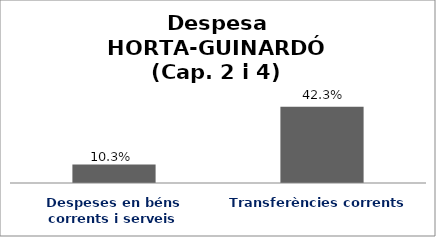
| Category | Series 0 |
|---|---|
| Despeses en béns corrents i serveis | 0.103 |
| Transferències corrents | 0.423 |